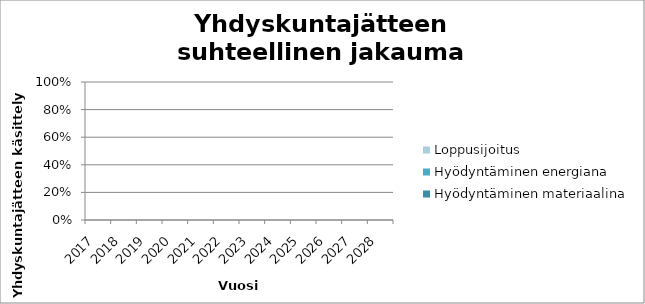
| Category | Hyödyntäminen materiaalina | Hyödyntäminen energiana | Loppusijoitus |
|---|---|---|---|
| 2017.0 | 0 | 0 | 0 |
| 2018.0 | 0 | 0 | 0 |
| 2019.0 | 0 | 0 | 0 |
| 2020.0 | 0 | 0 | 0 |
| 2021.0 | 0 | 0 | 0 |
| 2022.0 | 0 | 0 | 0 |
| 2023.0 | 0 | 0 | 0 |
| 2024.0 | 0 | 0 | 0 |
| 2025.0 | 0 | 0 | 0 |
| 2026.0 | 0 | 0 | 0 |
| 2027.0 | 0 | 0 | 0 |
| 2028.0 | 0 | 0 | 0 |